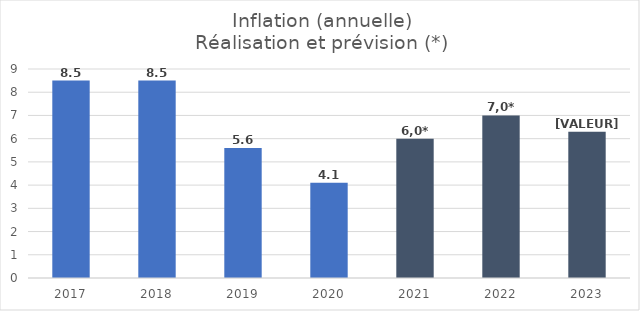
| Category | Inflation |
|---|---|
| 2017.0 | 8.5 |
| 2018.0 | 8.5 |
| 2019.0 | 5.6 |
| 2020.0 | 4.1 |
| 2021.0 | 6 |
| 2022.0 | 7 |
| 2023.0 | 6.3 |